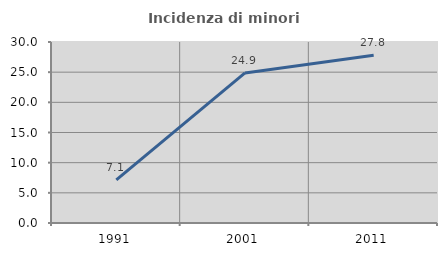
| Category | Incidenza di minori stranieri |
|---|---|
| 1991.0 | 7.143 |
| 2001.0 | 24.87 |
| 2011.0 | 27.82 |